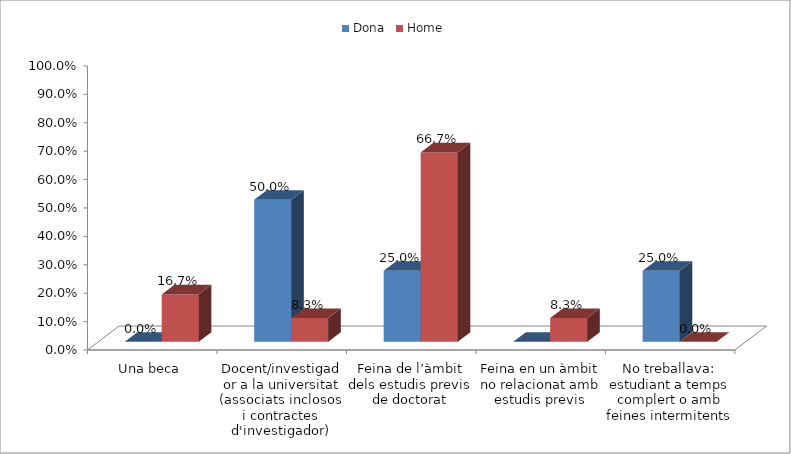
| Category | Dona | Home |
|---|---|---|
| Una beca | 0 | 0.167 |
| Docent/investigador a la universitat (associats inclosos i contractes d'investigador) | 0.5 | 0.083 |
| Feina de l’àmbit dels estudis previs de doctorat | 0.25 | 0.667 |
| Feina en un àmbit no relacionat amb estudis previs | 0 | 0.083 |
| No treballava: estudiant a temps complert o amb feines intermitents | 0.25 | 0 |